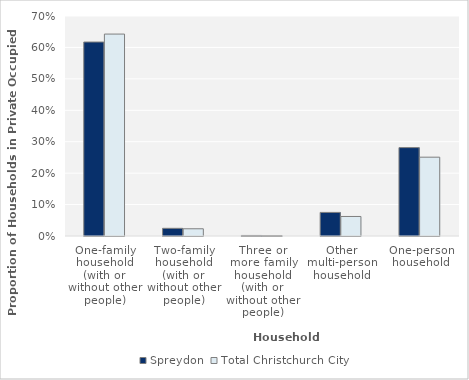
| Category | Spreydon | Total Christchurch City |
|---|---|---|
| One-family household (with or without other people) | 0.617 |  |
| Two-family household (with or without other people) | 0.024 |  |
| Three or more family household (with or without other people) | 0.002 |  |
| Other multi-person household | 0.075 |  |
| One-person household | 0.281 |  |